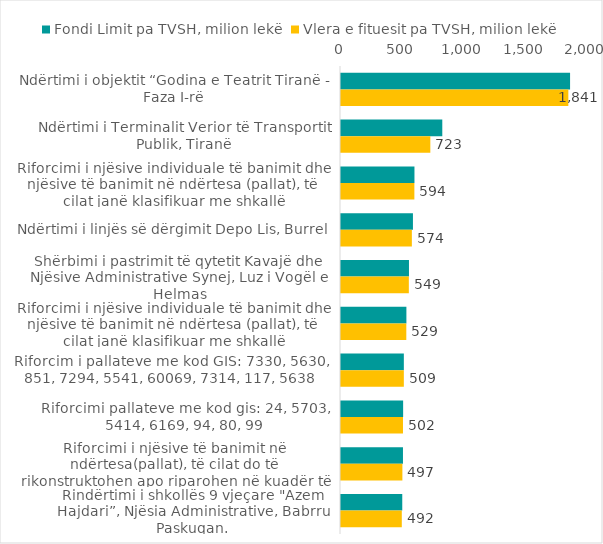
| Category | Fondi Limit pa TVSH, milion lekë | Vlera e fituesit pa TVSH, milion lekë |
|---|---|---|
| Ndërtimi i objektit “Godina e Teatrit Tiranë - Faza I-rë | 1854.829 | 1840.784 |
| Ndërtimi i Terminalit Verior të Transportit Publik, Tiranë | 820.178 | 723.315 |
| Riforcimi i njësive individuale të banimit dhe njësive të banimit në ndërtesa (pallat), të cilat janë klasifikuar me shkallë dëmtueshmërie DS4, Faza I-rë | 594.824 | 594.114 |
| Ndërtimi i linjës së dërgimit Depo Lis, Burrel | 582.5 | 573.761 |
| Shërbimi i pastrimit të qytetit Kavajë dhe Njësive Administrative Synej, Luz i Vogël e Helmas | 550.396 | 549.299 |
| Riforcimi i njësive individuale të banimit dhe njësive të banimit në ndërtesa (pallat), të cilat janë klasifikuar me shkallë dëmtueshmërie DS4, qyteti Kavajë | 529.518 | 528.844 |
| Riforcim i pallateve me kod GIS: 7330, 5630, 851, 7294, 5541, 60069, 7314, 117, 5638 | 508.846 | 508.8 |
| Riforcimi pallateve me kod gis: 24, 5703, 5414, 6169, 94, 80, 99 | 503.102 | 501.888 |
| Riforcimi i njësive të banimit në ndërtesa(pallat), të cilat do të rikonstruktohen apo riparohen në kuadër të procesit të rindërtimit | 501.755 | 497.093 |
| Rindërtimi i shkollës 9 vjeçare "Azem Hajdari”, Njësia Administrative, Babrru Paskuqan. | 496.07 | 492.29 |